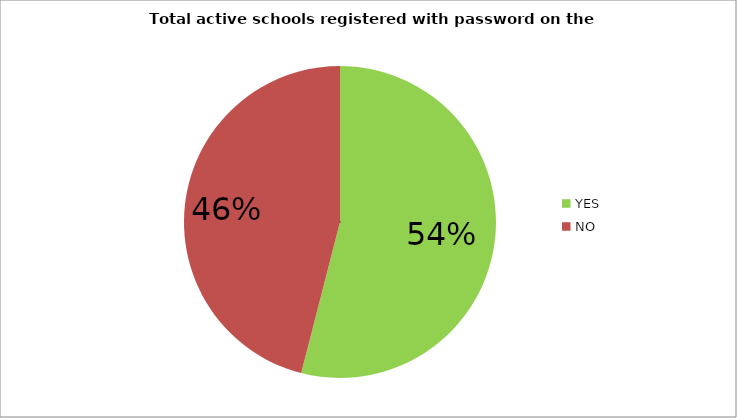
| Category | Totals schools registered with password on the school portal |
|---|---|
| YES | 0.54 |
| NO | 0.46 |